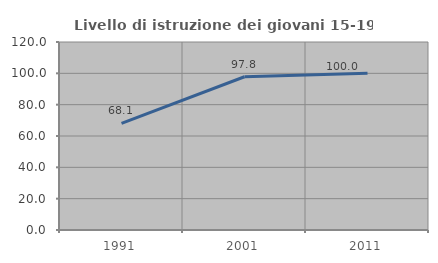
| Category | Livello di istruzione dei giovani 15-19 anni |
|---|---|
| 1991.0 | 68.067 |
| 2001.0 | 97.826 |
| 2011.0 | 100 |